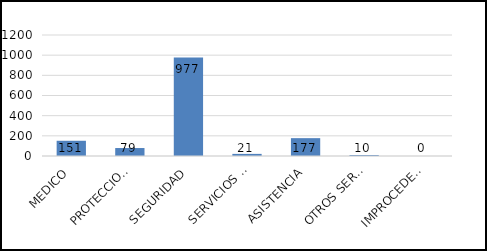
| Category | TOTAL |
|---|---|
| MEDICO | 151 |
| PROTECCION CIVIL | 79 |
| SEGURIDAD | 977 |
| SERVICIOS PUBLICOS | 21 |
| ASISTENCIA | 177 |
| OTROS SERVICIOS | 10 |
| IMPROCEDENTES | 0 |